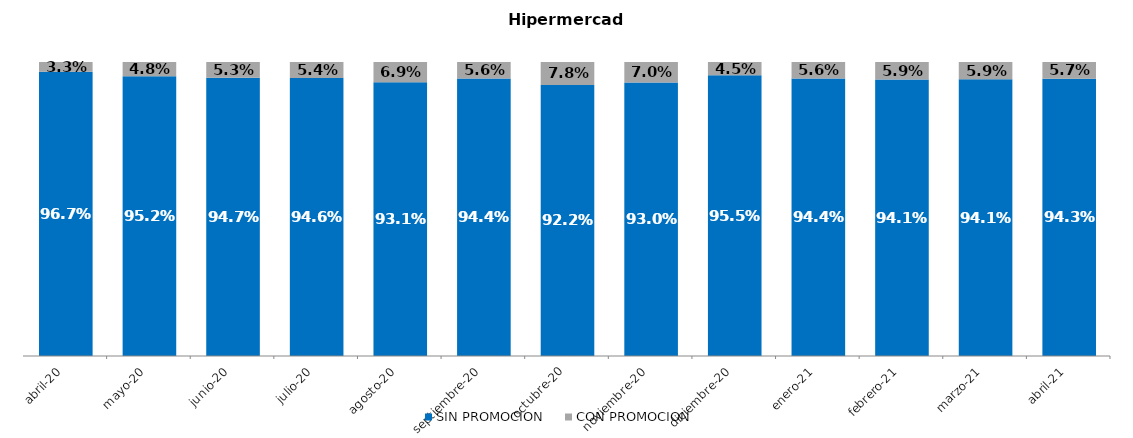
| Category | SIN PROMOCION   | CON PROMOCION   |
|---|---|---|
| 2020-04-01 | 0.967 | 0.033 |
| 2020-05-01 | 0.952 | 0.048 |
| 2020-06-01 | 0.947 | 0.053 |
| 2020-07-01 | 0.946 | 0.054 |
| 2020-08-01 | 0.931 | 0.069 |
| 2020-09-01 | 0.944 | 0.056 |
| 2020-10-01 | 0.922 | 0.078 |
| 2020-11-01 | 0.93 | 0.07 |
| 2020-12-01 | 0.955 | 0.045 |
| 2021-01-01 | 0.944 | 0.056 |
| 2021-02-01 | 0.941 | 0.059 |
| 2021-03-01 | 0.941 | 0.059 |
| 2021-04-01 | 0.943 | 0.057 |